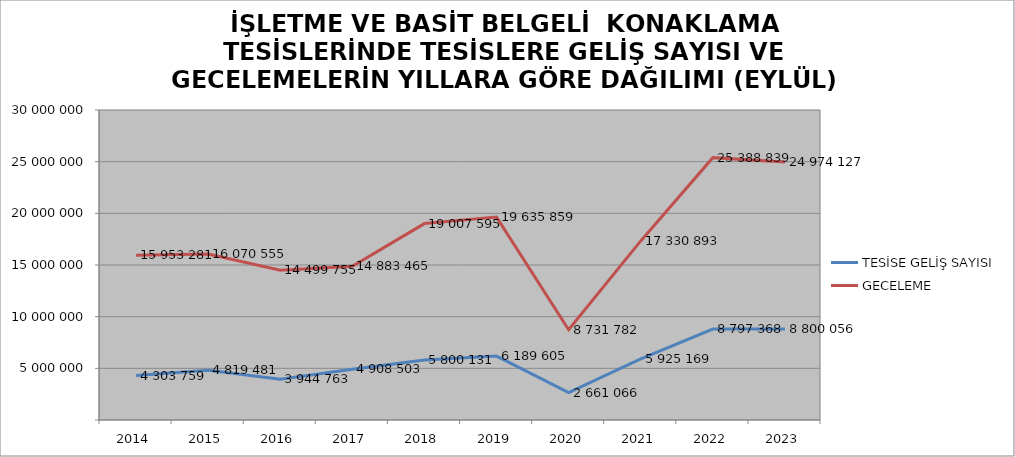
| Category | TESİSE GELİŞ SAYISI | GECELEME |
|---|---|---|
| 2014 | 4303759 | 15953281 |
| 2015 | 4819481 | 16070555 |
| 2016 | 3944763 | 14499755 |
| 2017 | 4908503 | 14883465 |
| 2018 | 5800131 | 19007595 |
| 2019 | 6189605 | 19635859 |
| 2020 | 2661066 | 8731782 |
| 2021 | 5925169 | 17330893 |
| 2022 | 8797368 | 25388839 |
| 2023 | 8800056 | 24974127 |